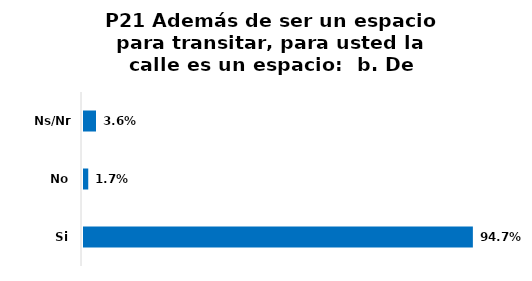
| Category | Series 0 |
|---|---|
| Si | 0.947 |
| No | 0.017 |
| Ns/Nr | 0.036 |